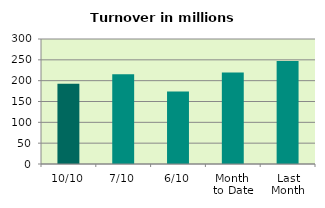
| Category | Series 0 |
|---|---|
| 10/10 | 192.35 |
| 7/10 | 215.347 |
| 6/10 | 174.126 |
| Month 
to Date | 219.569 |
| Last
Month | 247.353 |